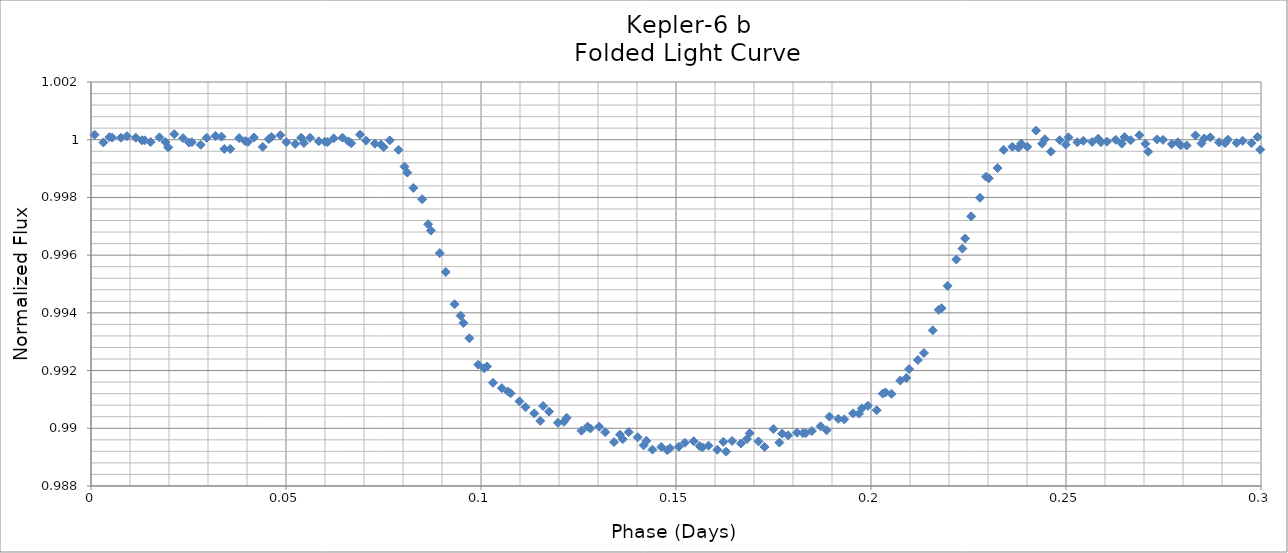
| Category | Series 0 |
|---|---|
| 2.442474000415206 | 1 |
| 2.462909000253678 | 1 |
| 2.483343000317365 | 1 |
| 2.503778000155837 | 1 |
| 2.524212000219524 | 1 |
| 2.544646000283212 | 1 |
| 2.565081000121683 | 1 |
| 2.585515000185371 | 1 |
| 2.605950000023842 | 1 |
| 2.62638400008753 | 1 |
| 2.646819000391662 | 1 |
| 2.667252999989689 | 1 |
| 2.687688000293821 | 1 |
| 2.708122000357509 | 1 |
| 2.728555999955535 | 1 |
| 2.748991000259668 | 1 |
| 2.769425000323356 | 1 |
| 2.789860000161827 | 1 |
| 2.810294000225515 | 1 |
| 2.830729000063986 | 1 |
| 2.851163000127673 | 1 |
| 2.871597000191361 | 1 |
| 2.892032000029832 | 1 |
| 2.91246600009352 | 1 |
| 2.932901000397653 | 1 |
| 2.95333499999568 | 1 |
| 2.973770000299812 | 1 |
| 2.994204000363499 | 1 |
| 3.014639000201971 | 1 |
| 3.035073000265658 | 1 |
| 3.055507000329346 | 1 |
| 3.075942000167817 | 1 |
| 3.096376000231505 | 1 |
| 3.116811000069976 | 1 |
| 3.137245000133664 | 1 |
| 3.157679999972135 | 1 |
| 3.178114000035823 | 1 |
| 3.19854800009951 | 1 |
| 3.218983000403643 | 1 |
| 0.00471700000166919 | 1 |
| 0.0251520003058019 | 1 |
| 0.0455860003694894 | 1 |
| 0.0660210002079609 | 1 |
| 0.0864550002716484 | 0.997 |
| 0.106889000335336 | 0.991 |
| 0.127324000173807 | 0.99 |
| 0.147758000237495 | 0.989 |
| 0.168193000075966 | 0.99 |
| 0.188627000139654 | 0.99 |
| 0.209061000203341 | 0.992 |
| 0.229496000041813 | 0.999 |
| 0.2499300001055 | 1 |
| 0.270365000409633 | 1 |
| 0.290800000248105 | 1 |
| 0.311234000311792 | 1 |
| 0.33166800037548 | 1 |
| 0.352103000213951 | 1 |
| 0.372537000277639 | 1 |
| 0.39297200011611 | 1 |
| 0.413406000179798 | 1 |
| 0.433841000018269 | 1 |
| 0.454275000081957 | 1 |
| 0.474709000145644 | 1 |
| 0.495143999984116 | 1 |
| 0.515578000047803 | 1 |
| 0.536013000351936 | 1 |
| 0.556447000415623 | 1 |
| 0.576882000254095 | 1 |
| 0.597316000317782 | 1 |
| 0.61775000038147 | 1 |
| 0.638185000219941 | 1 |
| 0.658619000283629 | 1 |
| 0.6790540001221 | 1 |
| 0.699488999960572 | 1 |
| 0.719922000249475 | 1 |
| 0.740357000087947 | 1 |
| 0.760791000151634 | 1 |
| 0.781225999990106 | 1 |
| 0.801661000294239 | 1 |
| 0.822095000357926 | 1 |
| 0.842528999955952 | 1 |
| 0.86296300001964 | 1 |
| 0.883398000323773 | 1 |
| 0.903833000162244 | 1 |
| 0.924267000225932 | 1 |
| 0.944702000064403 | 1 |
| 0.965135000353307 | 1 |
| 0.985570000191778 | 1 |
| 1.006004000255466 | 1 |
| 1.026439000093937 | 1 |
| 1.04687400039807 | 1 |
| 1.067307999996096 | 1 |
| 1.087742000059784 | 1 |
| 1.108176000123471 | 1 |
| 1.128610999961943 | 1 |
| 1.149046000266075 | 1 |
| 1.169480000329763 | 1 |
| 1.189915000168234 | 1 |
| 1.210349000231922 | 1 |
| 1.230783000295609 | 1 |
| 1.251218000134081 | 1 |
| 1.271652000197768 | 1 |
| 1.29208700003624 | 1 |
| 1.312522000340373 | 1 |
| 1.33295600040406 | 1 |
| 1.353390000002086 | 1 |
| 1.373824000065774 | 1 |
| 1.394259000369907 | 1 |
| 1.414694000208378 | 1 |
| 1.435128000272066 | 1 |
| 1.455563000110537 | 1 |
| 1.475996000399441 | 1 |
| 1.496431000237912 | 1 |
| 1.5168650003016 | 1 |
| 1.537300000140071 | 1 |
| 1.557734999978543 | 1 |
| 1.57816900004223 | 1 |
| 1.598603000105918 | 1 |
| 1.619037000169605 | 1 |
| 1.639472000008077 | 1 |
| 1.659907000312209 | 1 |
| 1.680341000375897 | 1 |
| 1.700776000214368 | 1 |
| 1.721210000278056 | 1 |
| 1.741644000341743 | 1 |
| 1.762079000180215 | 1 |
| 1.782513000243902 | 1 |
| 1.802948000082374 | 1 |
| 1.823382000146061 | 1 |
| 1.843816000209749 | 1 |
| 1.86425100004822 | 1 |
| 1.884685000111908 | 1 |
| 1.905120000416041 | 1 |
| 1.925555000254512 | 1 |
| 1.9459890003182 | 1 |
| 1.966424000156671 | 1 |
| 1.986856999979913 | 1 |
| 2.007292000284046 | 1 |
| 2.027726000347733 | 1 |
| 2.048161000186205 | 1 |
| 2.068596000024676 | 1 |
| 2.089030000088364 | 1 |
| 2.109464000152052 | 1 |
| 2.129898000215739 | 1 |
| 2.150333000054211 | 1 |
| 2.170768000358343 | 1 |
| 2.19120199995637 | 1 |
| 2.211637000260502 | 1 |
| 2.232070000083745 | 1 |
| 2.252505000387877 | 1 |
| 2.272940000226349 | 1 |
| 2.293374000290036 | 1 |
| 2.313809000128508 | 1 |
| 2.334243000192195 | 1 |
| 2.354677000255883 | 1 |
| 2.375112000094354 | 1 |
| 2.395546000158042 | 1 |
| 2.415980999996513 | 1 |
| 2.436415000060201 | 1 |
| 2.456850000364334 | 1 |
| 2.47728399996236 | 1 |
| 2.497718000026047 | 1 |
| 2.51815300033018 | 1 |
| 2.538587000393868 | 1 |
| 2.55902200023234 | 1 |
| 2.579457000070811 | 1 |
| 2.599890000359714 | 1 |
| 2.620325000198186 | 1 |
| 2.640759000261873 | 1 |
| 2.661194000100344 | 1 |
| 2.681628000164032 | 1 |
| 2.702063000002504 | 1 |
| 2.722498000306636 | 1 |
| 2.742931000129879 | 1 |
| 2.76336599996835 | 1 |
| 2.783801000272482 | 1 |
| 2.80423500033617 | 1 |
| 2.824670000174642 | 1 |
| 2.845104000238329 | 1 |
| 2.865538000302017 | 1 |
| 2.885972000365704 | 1 |
| 2.906407000204176 | 1 |
| 2.926842000042647 | 1 |
| 2.947276000106335 | 1 |
| 2.967711000410467 | 1 |
| 2.988145000008494 | 1 |
| 3.008579000072181 | 1 |
| 3.029014000376314 | 1 |
| 3.04944799997434 | 1 |
| 3.069883000278473 | 1 |
| 3.090318000116945 | 1 |
| 3.110751000405848 | 1 |
| 3.13118600024432 | 1 |
| 3.151620000308007 | 1 |
| 3.172055000146479 | 1 |
| 3.192489000210166 | 1 |
| 3.212924000048638 | 1 |
| 3.233358000112325 | 1 |
| 0.0190920001760126 | 1 |
| 0.0395270000144841 | 1 |
| 0.0599620003186167 | 1 |
| 0.0803960003823043 | 0.999 |
| 0.100829999980331 | 0.992 |
| 0.121264000044018 | 0.99 |
| 0.141699000348151 | 0.989 |
| 0.162134000186622 | 0.99 |
| 0.18256800025031 | 0.99 |
| 0.203003000088781 | 0.991 |
| 0.223437000152469 | 0.996 |
| 0.24387199999094 | 1 |
| 0.264306000054628 | 1 |
| 0.284740000118315 | 1 |
| 0.305174999956787 | 1 |
| 0.325609000020474 | 1 |
| 0.346044000324607 | 1 |
| 0.366478000388295 | 1 |
| 0.386911999986321 | 1 |
| 0.407347000290454 | 1 |
| 0.427781000354141 | 1 |
| 0.448216000192613 | 1 |
| 0.4686500002563 | 1 |
| 0.489085000094771 | 1 |
| 0.509519000158459 | 1 |
| 0.529953000222147 | 1 |
| 0.550388000060618 | 1 |
| 0.570822000124306 | 1 |
| 0.591256999962777 | 1 |
| 0.611691000026465 | 1 |
| 0.632125000090152 | 1 |
| 0.652560000394285 | 1 |
| 0.672995000232756 | 1 |
| 0.693429000296444 | 1 |
| 0.713863000360131 | 1 |
| 0.734298000198603 | 1 |
| 0.75473200026229 | 1 |
| 0.775167000100762 | 1 |
| 0.795601000164449 | 1 |
| 0.816035000228137 | 1 |
| 0.836470000066608 | 1 |
| 0.856905000370741 | 1 |
| 0.877338000193983 | 1 |
| 0.897773000032455 | 1 |
| 0.918208000336588 | 1 |
| 0.938642000400275 | 1 |
| 0.959077000238747 | 1 |
| 0.979511000302434 | 1 |
| 0.999945000366122 | 1 |
| 1.020380000204593 | 1 |
| 1.040814000268281 | 1 |
| 1.061248000331968 | 1 |
| 1.08168300017044 | 1 |
| 1.102118000008911 | 1 |
| 1.122553000313044 | 1 |
| 1.142986000136286 | 1 |
| 1.163420999974758 | 1 |
| 1.183855000038445 | 1 |
| 1.204290000342578 | 1 |
| 1.224724000406265 | 1 |
| 1.245159000244737 | 1 |
| 1.265593000308424 | 1 |
| 1.286027000372112 | 1 |
| 1.306462000210583 | 1 |
| 1.326896000274271 | 1 |
| 1.347331000112742 | 1 |
| 1.367766000416875 | 1 |
| 1.388199000240117 | 1 |
| 1.408634000078589 | 1 |
| 1.429068000142276 | 1 |
| 1.449502999980748 | 1 |
| 1.46993800028488 | 1 |
| 1.490372000348568 | 1 |
| 1.510806000412256 | 1 |
| 1.531241000250727 | 1 |
| 1.551675000314415 | 1 |
| 1.572110000152886 | 1 |
| 1.592544000216574 | 1 |
| 1.612979000055045 | 1 |
| 1.633413000118732 | 1 |
| 1.65384700018242 | 1 |
| 1.674282000020891 | 1 |
| 1.69471600008458 | 1 |
| 1.715151000388712 | 1 |
| 1.735584999986738 | 1 |
| 1.756019000050426 | 1 |
| 1.776454000354558 | 1 |
| 1.796888000418246 | 1 |
| 1.817323000256717 | 1 |
| 1.837757000320405 | 1 |
| 1.858192000158876 | 1 |
| 1.878626999997348 | 1 |
| 1.899060000286251 | 1 |
| 1.919495000124723 | 1 |
| 1.93992900018841 | 1 |
| 1.960364000026882 | 1 |
| 1.980798000090569 | 1 |
| 2.001233000394702 | 1 |
| 2.021666999992728 | 1 |
| 2.042102000296861 | 1 |
| 2.062536000360549 | 1 |
| 2.082969999958575 | 1 |
| 2.103405000262708 | 1 |
| 2.12384000010118 | 1 |
| 2.144274000164867 | 1 |
| 2.164708000228554 | 1 |
| 2.185142000292242 | 1 |
| 2.205577000130713 | 1 |
| 2.226011999969185 | 1 |
| 2.246446000032872 | 1 |
| 2.26688000009656 | 1 |
| 2.287315000400692 | 1 |
| 2.307748999998719 | 1 |
| 2.328184000302851 | 1 |
| 2.348618000366539 | 1 |
| 2.36905300020501 | 1 |
| 2.389487000268698 | 1 |
| 2.409921000332385 | 1 |
| 2.450790000234544 | 1 |
| 2.471225000073016 | 1 |
| 2.491660000377148 | 1 |
| 2.512093000200391 | 1 |
| 2.532528000038862 | 1 |
| 2.55296200010255 | 1 |
| 2.573397000406682 | 1 |
| 2.593832000245154 | 1 |
| 2.614266000308842 | 1 |
| 2.634701000147312 | 1 |
| 2.655135000211 | 1 |
| 2.675569000274688 | 1 |
| 2.696003000338376 | 1 |
| 2.716438000176847 | 1 |
| 2.736873000015318 | 1 |
| 2.757307000079006 | 1 |
| 2.777741000142693 | 1 |
| 2.798175000206381 | 1 |
| 2.818610000044853 | 1 |
| 2.839045000348985 | 1 |
| 2.859479000412673 | 1 |
| 2.879914000251144 | 1 |
| 2.900348000314832 | 1 |
| 2.920782000378519 | 1 |
| 2.941217000216991 | 1 |
| 2.961651000280678 | 1 |
| 2.98208600011915 | 1 |
| 3.002520999957621 | 1 |
| 3.022954000246525 | 1 |
| 3.043388000310212 | 1 |
| 3.063823000148684 | 1 |
| 3.084257999987155 | 1 |
| 3.104693000291288 | 1 |
| 3.125127000354975 | 1 |
| 3.145561000418663 | 1 |
| 3.165995000016689 | 1 |
| 3.186430000320822 | 1 |
| 3.20686400038451 | 1 |
| 3.227299000222981 | 1 |
| 0.0130340000614524 | 1 |
| 0.0334670003503561 | 1 |
| 0.0539020001888275 | 1 |
| 0.0743360002525151 | 1 |
| 0.0947710000909865 | 0.994 |
| 0.115206000395119 | 0.99 |
| 0.135639999993145 | 0.99 |
| 0.156075000297278 | 0.989 |
| 0.176508000120521 | 0.99 |
| 0.196942999958992 | 0.991 |
| 0.217378000263125 | 0.994 |
| 0.237812000326812 | 1 |
| 0.258247000165284 | 1 |
| 0.278682000003755 | 1 |
| 0.299115000292659 | 1 |
| 0.319549000356346 | 1 |
| 0.339984000194818 | 1 |
| 0.360419000033289 | 1 |
| 0.380853000096977 | 1 |
| 0.401288000401109 | 1 |
| 0.421721999999136 | 1 |
| 0.442156000062823 | 1 |
| 0.462591000366956 | 1 |
| 0.483024999964982 | 1 |
| 0.503460000269115 | 1 |
| 0.523895000107586 | 1 |
| 0.54432800039649 | 1 |
| 0.564763000234961 | 1 |
| 0.585197000298649 | 1 |
| 0.60563200013712 | 1 |
| 0.626066999975592 | 1 |
| 0.646501000039279 | 1 |
| 0.666935000102967 | 1 |
| 0.687369000166654 | 1 |
| 0.707804000005126 | 1 |
| 0.728239000309259 | 1 |
| 0.748673000372946 | 1 |
| 0.769108000211418 | 1 |
| 0.789542000275105 | 1 |
| 0.809976000338793 | 1 |
| 0.83041000040248 | 1 |
| 0.850845000240952 | 1 |
| 0.871280000079423 | 1 |
| 0.891715000383556 | 1 |
| 0.912148999981582 | 1 |
| 0.932582000270486 | 1 |
| 0.953017000108957 | 1 |
| 0.973451000172645 | 1 |
| 0.993887000251561 | 1 |
| 1.014321000315249 | 1 |
| 1.03475600015372 | 1 |
| 1.055188999976963 | 1 |
| 1.07562300004065 | 1 |
| 1.096059000119567 | 1 |
| 1.116493000183254 | 1 |
| 1.136928000021726 | 1 |
| 1.157362000085413 | 1 |
| 1.177795000374317 | 1 |
| 1.198230000212789 | 1 |
| 1.21866500005126 | 1 |
| 1.239100000355393 | 1 |
| 1.25953400041908 | 1 |
| 1.279969000257552 | 1 |
| 1.300402000080794 | 1 |
| 1.320837000384927 | 1 |
| 1.341272000223398 | 1 |
| 1.361706000287086 | 1 |
| 1.382141000125557 | 1 |
| 1.402575000189245 | 1 |
| 1.423008000012487 | 1 |
| 1.443444000091404 | 1 |
| 1.463878000155091 | 1 |
| 1.484312999993563 | 1 |
| 1.50474700005725 | 1 |
| 1.525182000361383 | 1 |
| 1.545615000184625 | 1 |
| 1.566050000023097 | 1 |
| 1.586485000327229 | 1 |
| 1.606919000390917 | 1 |
| 1.627354000229388 | 1 |
| 1.647788000293076 | 1 |
| 1.668223000131547 | 1 |
| 1.688657000195235 | 1 |
| 1.709091000258923 | 1 |
| 1.729526000097394 | 1 |
| 1.749960000161081 | 1 |
| 1.770394999999553 | 1 |
| 1.790830000303686 | 1 |
| 1.811263000126928 | 1 |
| 1.831697999965399 | 1 |
| 1.852132000029087 | 1 |
| 1.87256700033322 | 1 |
| 1.893002000171691 | 1 |
| 1.913436000235379 | 1 |
| 1.933870000299066 | 1 |
| 1.954304000362754 | 1 |
| 1.974739000201225 | 1 |
| 1.995174000039697 | 1 |
| 2.015609000343829 | 1 |
| 2.036043000407517 | 1 |
| 2.056476000230759 | 1 |
| 2.076911000069231 | 1 |
| 2.097345000132918 | 1 |
| 2.117781000211835 | 1 |
| 2.138215000275522 | 1 |
| 2.15864900033921 | 1 |
| 2.179083000402898 | 1 |
| 2.199517000000924 | 1 |
| 2.219952000305057 | 1 |
| 2.240387000143528 | 1 |
| 2.260821999982 | 1 |
| 2.281256000045687 | 1 |
| 2.301689000334591 | 1 |
| 2.322124000173062 | 1 |
| 2.34255800023675 | 1 |
| 2.362994000315666 | 1 |
| 2.383428000379354 | 1 |
| 2.403863000217825 | 1 |
| 2.424297000281512 | 1 |
| 2.444730000104755 | 1 |
| 0.476966000075638 | 1 |
| 0.497400000139326 | 1 |
| 0.517834999977797 | 1 |
| 0.538269000041485 | 1 |
| 0.558704000345617 | 1 |
| 0.579138000409305 | 1 |
| 0.599572000007331 | 1 |
| 0.620007000311464 | 1 |
| 0.640441000375151 | 1 |
| 0.660876000213623 | 1 |
| 0.68131000027731 | 1 |
| 0.701745000115782 | 1 |
| 0.722179000179469 | 1 |
| 0.742613000243157 | 1 |
| 0.763048000081628 | 1 |
| 0.783482000145316 | 1 |
| 0.803916999983787 | 1 |
| 0.824351000047475 | 1 |
| 0.844786000351608 | 1 |
| 0.865220000415295 | 1 |
| 0.885655000253767 | 1 |
| 0.906089000317454 | 1 |
| 0.926523000381142 | 1 |
| 0.946958000219613 | 1 |
| 0.967392000283301 | 1 |
| 0.987827000121772 | 1 |
| 1.00826100018546 | 1 |
| 1.028696000023931 | 1 |
| 1.049130000087619 | 1 |
| 1.069564000151306 | 1 |
| 1.089998999989778 | 1 |
| 1.110433000053465 | 1 |
| 1.130868000357598 | 1 |
| 1.151301999955624 | 1 |
| 1.171737000259757 | 1 |
| 1.192171000323444 | 1 |
| 1.212605000387132 | 1 |
| 1.233040000225603 | 1 |
| 1.253474000289291 | 1 |
| 1.273909000127762 | 1 |
| 1.29434300019145 | 1 |
| 1.314778000029921 | 1 |
| 1.335212000093609 | 1 |
| 1.355646000157296 | 1 |
| 1.376080999995768 | 1 |
| 1.396515000059455 | 1 |
| 1.416950000363588 | 1 |
| 1.437383999961614 | 1 |
| 1.457819000265747 | 1 |
| 1.478253000329435 | 1 |
| 1.498687000393122 | 1 |
| 1.519122000231594 | 1 |
| 1.539556000295281 | 1 |
| 1.559991000133753 | 1 |
| 1.58042500019744 | 1 |
| 1.600860000035912 | 1 |
| 1.621294000099599 | 1 |
| 1.641729000403732 | 1 |
| 1.662163000001758 | 1 |
| 1.682597000065446 | 1 |
| 1.703032000369578 | 1 |
| 1.723465999967605 | 1 |
| 1.743901000271737 | 1 |
| 1.764335000335425 | 1 |
| 1.784770000173896 | 1 |
| 1.805204000237584 | 1 |
| 1.825638000301271 | 1 |
| 1.846073000139743 | 1 |
| 1.86650700020343 | 1 |
| 1.886942000041902 | 1 |
| 1.907376000105589 | 1 |
| 1.927811000409722 | 1 |
| 1.948245000007748 | 1 |
| 1.968680000311881 | 1 |
| 1.989114000375569 | 1 |
| 2.009547999973595 | 1 |
| 2.029983000277728 | 1 |
| 2.050417000341415 | 1 |
| 2.070852000179887 | 1 |
| 2.091286000243574 | 1 |
| 2.111721000082046 | 1 |
| 2.132155000145733 | 1 |
| 2.152589000209421 | 1 |
| 2.173024000047892 | 1 |
| 2.19345800011158 | 1 |
| 2.213893000415712 | 1 |
| 2.234327000013739 | 1 |
| 2.254762000317871 | 1 |
| 2.275196000381559 | 1 |
| 2.295629999979585 | 1 |
| 2.316065000283718 | 1 |
| 2.336499000347405 | 1 |
| 2.356934000185877 | 1 |
| 2.377368000249564 | 1 |
| 2.397803000088036 | 1 |
| 2.418237000151723 | 1 |
| 2.438671000215411 | 1 |
| 2.459106000053882 | 1 |
| 2.47954000011757 | 1 |
| 2.499974999956041 | 1 |
| 2.520409000019729 | 1 |
| 2.540844000323862 | 1 |
| 2.561278000387549 | 1 |
| 2.581713000226021 | 1 |
| 2.602147000289708 | 1 |
| 2.62258200012818 | 1 |
| 2.643016000191867 | 1 |
| 2.663450000255555 | 1 |
| 2.683885000094026 | 1 |
| 2.704319000157713 | 1 |
| 2.724753999996185 | 1 |
| 2.745188000059873 | 1 |
| 2.76562200012356 | 1 |
| 2.786056999962032 | 1 |
| 2.806491000025719 | 1 |
| 2.826926000329852 | 1 |
| 2.847360000393539 | 1 |
| 2.867795000232011 | 1 |
| 2.888229000295698 | 1 |
| 2.90866400013417 | 1 |
| 2.929098000197857 | 1 |
| 2.949532000261545 | 1 |
| 2.969967000100016 | 1 |
| 2.990401000163704 | 1 |
| 3.010836000002175 | 1 |
| 3.031270000065863 | 1 |
| 3.051705000369996 | 1 |
| 3.072138999968022 | 1 |
| 3.09257300003171 | 1 |
| 3.113008000335842 | 1 |
| 3.13344200039953 | 1 |
| 3.153877000238001 | 1 |
| 3.174311000301689 | 1 |
| 3.19474600014016 | 1 |
| 3.215180000203848 | 1 |
| 0.000914000267535186 | 1 |
| 0.0213490001060066 | 1 |
| 0.0417830001696942 | 1 |
| 0.0622180000081656 | 1 |
| 0.0826520000718531 | 0.998 |
| 0.103087000375986 | 0.992 |
| 0.143956000278145 | 0.989 |
| 0.164390000341832 | 0.99 |
| 0.18482400040552 | 0.99 |
| 0.205259000243991 | 0.991 |
| 0.225693000307679 | 0.997 |
| 0.24612800014615 | 1 |
| 0.266562000209838 | 1 |
| 0.286996000273525 | 1 |
| 0.307431000111997 | 1 |
| 0.327865000175684 | 1 |
| 0.348300000014156 | 1 |
| 0.368734000077843 | 1 |
| 0.389169000381976 | 1 |
| 0.409602999980002 | 1 |
| 0.430038000284135 | 1 |
| 0.450472000347823 | 1 |
| 0.470907000186294 | 1 |
| 0.491341000249982 | 1 |
| 0.511775000313669 | 1 |
| 0.532210000152141 | 1 |
| 0.552644000215828 | 1 |
| 0.5730790000543 | 1 |
| 0.593513000117987 | 1 |
| 0.613947999956458 | 1 |
| 0.634382000020146 | 1 |
| 0.654816000083834 | 1 |
| 0.675251000387966 | 1 |
| 0.695684999985993 | 1 |
| 0.716120000290125 | 1 |
| 0.736554000353813 | 1 |
| 0.756989000192284 | 1 |
| 0.777423000255972 | 1 |
| 0.797857000319659 | 1 |
| 0.818292000158131 | 1 |
| 0.838726000221818 | 1 |
| 0.85916100006029 | 1 |
| 0.879595000123977 | 1 |
| 0.900029999962449 | 1 |
| 0.920464000026136 | 1 |
| 0.940898000089824 | 1 |
| 0.961333000393957 | 1 |
| 0.981766999991983 | 1 |
| 1.002202000296116 | 1 |
| 1.022636000359803 | 1 |
| 1.043071000198275 | 1 |
| 1.063505000261962 | 1 |
| 1.08393900032565 | 1 |
| 1.104374000164121 | 1 |
| 1.124808000227809 | 1 |
| 1.14524300006628 | 1 |
| 1.165677000129968 | 1 |
| 1.18611199996844 | 1 |
| 1.206546000032127 | 1 |
| 1.226981000336259 | 1 |
| 1.247415000399947 | 1 |
| 1.267848999997973 | 1 |
| 1.288284000302106 | 1 |
| 1.308718000365793 | 1 |
| 1.329153000204265 | 1 |
| 1.349587000267952 | 1 |
| 1.370022000106424 | 1 |
| 1.390456000170111 | 1 |
| 1.410891000008583 | 1 |
| 1.43132500007227 | 1 |
| 1.451759000135958 | 1 |
| 1.472193999974429 | 1 |
| 1.492628000038117 | 1 |
| 1.51306300034225 | 1 |
| 1.533497000405937 | 1 |
| 1.553932000244409 | 1 |
| 1.574366000308096 | 1 |
| 1.594800000371784 | 1 |
| 1.615235000210255 | 1 |
| 1.635669000273943 | 1 |
| 1.656104000112414 | 1 |
| 1.676538000176102 | 1 |
| 1.696973000014573 | 1 |
| 1.717407000078261 | 1 |
| 1.737841000141948 | 1 |
| 1.75827599998042 | 1 |
| 1.778710000044107 | 1 |
| 1.79914500034824 | 1 |
| 1.819579000411927 | 1 |
| 1.840014000250399 | 1 |
| 1.860448000314086 | 1 |
| 1.880882000377774 | 1 |
| 1.901317000216245 | 1 |
| 1.921751000279933 | 1 |
| 1.942186000118404 | 1 |
| 1.962620000182092 | 1 |
| 1.983055000020563 | 1 |
| 2.003489000084251 | 1 |
| 2.023923000147938 | 1 |
| 2.04435799998641 | 1 |
| 2.064792000050097 | 1 |
| 2.08522700035423 | 1 |
| 2.105661000417917 | 1 |
| 2.12609600025639 | 1 |
| 2.146530000320076 | 1 |
| 2.166965000158548 | 1 |
| 2.187399000222235 | 1 |
| 2.207833000285923 | 1 |
| 2.228268000124395 | 1 |
| 2.248702000188082 | 1 |
| 2.269137000026553 | 1 |
| 2.289571000090241 | 1 |
| 2.310006000394374 | 1 |
| 2.3304399999924 | 1 |
| 2.350874000056088 | 1 |
| 2.37130900036022 | 1 |
| 2.391742999958247 | 1 |
| 2.412178000262379 | 1 |
| 2.432612000326067 | 1 |
| 2.453047000164538 | 1 |
| 2.473481000228226 | 1 |
| 2.493916000066697 | 1 |
| 2.514350000130385 | 1 |
| 2.534784000194072 | 1 |
| 2.555219000032544 | 1 |
| 2.575653000096231 | 1 |
| 2.596088000400364 | 1 |
| 2.61652199999839 | 1 |
| 2.636957000302523 | 1 |
| 2.65739100036621 | 1 |
| 2.677824999964237 | 1 |
| 2.69826000026837 | 1 |
| 2.718694000332057 | 1 |
| 2.739129000170529 | 1 |
| 2.759563000234216 | 1 |
| 2.779998000072688 | 1 |
| 2.800432000136375 | 1 |
| 2.820866000200063 | 1 |
| 2.841301000038534 | 1 |
| 2.861735000102222 | 1 |
| 2.882170000406354 | 1 |
| 2.902604000004381 | 1 |
| 2.923039000308513 | 1 |
| 2.943473000372201 | 1 |
| 2.963908000210672 | 1 |
| 2.98434200027436 | 1 |
| 3.004776000338047 | 1 |
| 3.025211000176519 | 1 |
| 3.045645000240206 | 1 |
| 3.066080000078678 | 1 |
| 3.086514000142365 | 1 |
| 3.127383000044524 | 1 |
| 3.147817000108212 | 1 |
| 3.168252000412345 | 1 |
| 3.188686000010371 | 1 |
| 3.209121000314503 | 1 |
| 3.229555000378191 | 1 |
| 0.0152900002166625 | 1 |
| 0.03572400028035 | 1 |
| 0.0561590001188215 | 1 |
| 0.076593000182509 | 1 |
| 0.0970270002461966 | 0.993 |
| 0.117462000084668 | 0.991 |
| 0.137896000148356 | 0.99 |
| 0.158330999986827 | 0.989 |
| 0.178765000050515 | 0.99 |
| 0.199200000354647 | 0.991 |
| 0.219634000418335 | 0.995 |
| 0.240068000016361 | 1 |
| 0.260503000320494 | 1 |
| 0.280937000384181 | 1 |
| 0.301372000222653 | 1 |
| 0.32180600028634 | 1 |
| 0.342241000124812 | 1 |
| 0.362675000188499 | 1 |
| 0.383109000252187 | 1 |
| 0.403544000090658 | 1 |
| 0.423978000154346 | 1 |
| 0.444412999992817 | 1 |
| 0.464847000056505 | 1 |
| 0.485282000360637 | 1 |
| 0.505715999958664 | 1 |
| 0.526150000022351 | 1 |
| 0.546585000326484 | 1 |
| 0.567019000390172 | 1 |
| 0.587454000228643 | 1 |
| 0.60788800029233 | 1 |
| 0.628323000130802 | 1 |
| 0.648757000194489 | 1 |
| 0.669191000258177 | 1 |
| 0.689626000096648 | 1 |
| 0.710060000160336 | 1 |
| 0.730494999998807 | 1 |
| 0.750929000062495 | 1 |
| 0.771364000366628 | 1 |
| 0.791797999964654 | 1 |
| 0.812233000268787 | 1 |
| 0.832667000332474 | 1 |
| 0.853102000170946 | 1 |
| 0.873536000234633 | 1 |
| 0.893970000298321 | 1 |
| 0.914405000136792 | 1 |
| 0.93483900020048 | 1 |
| 0.955274000038951 | 1 |
| 0.975708000102639 | 1 |
| 0.996143000406771 | 1 |
| 1.016577000004798 | 1 |
| 1.037011000068485 | 1 |
| 1.057446000372618 | 1 |
| 1.077879999970644 | 1 |
| 1.098315000274777 | 1 |
| 1.118749000338465 | 1 |
| 1.139184000176936 | 1 |
| 1.159618000240624 | 1 |
| 1.180052000304311 | 1 |
| 1.200487000142783 | 1 |
| 1.22092100020647 | 1 |
| 1.241356000044941 | 1 |
| 1.261790000108629 | 1 |
| 1.282225000412762 | 1 |
| 1.302659000010788 | 1 |
| 1.323093000074476 | 1 |
| 1.343528000378608 | 1 |
| 1.363961999976635 | 1 |
| 1.384397000280767 | 1 |
| 1.404831000344455 | 1 |
| 1.425266000182926 | 1 |
| 1.445700000246614 | 1 |
| 1.466134000310301 | 1 |
| 1.486569000148773 | 1 |
| 1.50700300021246 | 1 |
| 1.527438000050932 | 1 |
| 1.547872000114619 | 1 |
| 1.568307000418752 | 1 |
| 1.588741000016778 | 1 |
| 1.609176000320911 | 1 |
| 1.629610000384598 | 1 |
| 1.650043999982625 | 1 |
| 1.670479000286757 | 1 |
| 1.690913000350445 | 1 |
| 1.711348000188916 | 1 |
| 1.731782000252604 | 1 |
| 1.752217000091075 | 1 |
| 1.772651000154763 | 1 |
| 1.793085000218451 | 1 |
| 1.813520000056922 | 1 |
| 1.83395400012061 | 1 |
| 1.854388999959081 | 1 |
| 1.874823000022769 | 1 |
| 1.895258000326901 | 1 |
| 1.915692000390589 | 1 |
| 1.93612700022906 | 1 |
| 1.956561000292748 | 1 |
| 1.976995000356435 | 1 |
| 1.997430000194907 | 1 |
| 2.017864000258594 | 1 |
| 2.038299000097066 | 1 |
| 2.058733000160753 | 1 |
| 2.079167999999225 | 1 |
| 2.099602000062912 | 1 |
| 2.1200360001266 | 1 |
| 2.140470999965071 | 1 |
| 2.160905000028759 | 1 |
| 2.181340000332892 | 1 |
| 2.20177400039658 | 1 |
| 2.222209000235051 | 1 |
| 2.242643000298738 | 1 |
| 2.263077000362425 | 1 |
| 2.283512000200897 | 1 |
| 2.303946000264585 | 1 |
| 2.324381000103056 | 1 |
| 2.344815000166744 | 1 |
| 2.365250000005215 | 1 |
| 2.385684000068903 | 1 |
| 2.40611800013259 | 1 |
| 2.426552999971062 | 1 |
| 2.446987000034749 | 1 |
| 2.467422000338882 | 1 |
| 2.487856000402569 | 1 |
| 2.508291000241041 | 1 |
| 2.528725000304728 | 1 |
| 2.5491600001432 | 1 |
| 2.569594000206887 | 1 |
| 2.590028000270575 | 1 |
| 2.610463000109046 | 1 |
| 2.630897000172734 | 1 |
| 2.651332000011205 | 1 |
| 2.671766000074893 | 1 |
| 2.692201000379025 | 1 |
| 2.712634999977052 | 1 |
| 2.733069000040739 | 1 |
| 2.753504000344872 | 1 |
| 2.77393800040856 | 1 |
| 2.794373000247031 | 1 |
| 2.814807000310719 | 1 |
| 2.83524200014919 | 1 |
| 2.876110000276565 | 1 |
| 2.896545000115037 | 1 |
| 2.916979000178724 | 1 |
| 2.937414000017196 | 1 |
| 2.957848000080883 | 1 |
| 2.978283000385016 | 1 |
| 2.998716999983042 | 1 |
| 3.01915100004673 | 1 |
| 3.039586000350862 | 1 |
| 3.06002000041455 | 1 |
| 3.080455000253021 | 1 |
| 3.100889000316709 | 1 |
| 3.12132400015518 | 1 |
| 3.141758000218868 | 1 |
| 3.162192000282555 | 1 |
| 3.182627000121027 | 1 |
| 3.203061000184714 | 1 |
| 3.223496000023186 | 1 |
| 0.00923000008687324 | 1 |
| 0.0296650003910059 | 1 |
| 0.0500989999890322 | 1 |
| 0.0705340002931649 | 1 |
| 0.0909680003568525 | 0.995 |
| 0.111403000195324 | 0.991 |
| 0.131837000259011 | 0.99 |
| 0.152271000322699 | 0.989 |
| 0.17270600016117 | 0.989 |
| 0.193140000224858 | 0.99 |
| 0.213575000063329 | 0.993 |
| 0.234009000127017 | 1 |
| 0.254443000190705 | 1 |
| 0.274878000029176 | 1 |
| 0.295312000092863 | 1 |
| 0.315747000396996 | 1 |
| 0.336180999995022 | 1 |
| 0.356616000299155 | 1 |
| 0.377050000362843 | 1 |
| 0.397485000201314 | 1 |
| 0.417919000265002 | 1 |
| 0.438353000328689 | 1 |
| 0.458788000167161 | 1 |
| 0.479222000230848 | 1 |
| 0.49965700006932 | 1 |
| 0.520091000133007 | 1 |
| 0.540525999971479 | 1 |
| 0.560960000035166 | 1 |
| 0.581394000098854 | 1 |
| 0.601829000402986 | 1 |
| 0.622263000001013 | 1 |
| 0.642698000305145 | 1 |
| 0.663132000368833 | 1 |
| 0.683567000207304 | 1 |
| 0.704001000270992 | 1 |
| 0.724435000334679 | 1 |
| 0.744870000173151 | 1 |
| 0.765304000236838 | 1 |
| 0.78573900007531 | 1 |
| 0.806173000138997 | 1 |
| 0.826607999977469 | 1 |
| 0.847042000041156 | 1 |
| 0.867477000345289 | 1 |
| 0.887911000408977 | 1 |
| 0.908345000007003 | 1 |
| 0.928780000311136 | 1 |
| 0.949214000374823 | 1 |
| 0.969649000213295 | 1 |
| 0.990083000276982 | 1 |
| 1.010518000115454 | 1 |
| 1.030952000179141 | 1 |
| 1.051386000242829 | 1 |
| 1.0718210000813 | 1 |
| 1.092255000144988 | 1 |
| 1.11268999998346 | 1 |
| 1.133124000047147 | 1 |
| 1.153559000351279 | 1 |
| 1.173993000414967 | 1 |
| 1.194428000253438 | 1 |
| 1.214862000317126 | 1 |
| 1.235296000380814 | 1 |
| 1.255731000219285 | 1 |
| 1.276165000282973 | 1 |
| 1.296600000121444 | 1 |
| 1.317034000185131 | 1 |
| 1.337469000023603 | 1 |
| 1.35790300008729 | 1 |
| 1.378337000150978 | 1 |
| 1.398771999989449 | 1 |
| 1.419206000053137 | 1 |
| 1.43964100035727 | 1 |
| 1.460074999955296 | 1 |
| 1.480510000259429 | 1 |
| 1.500944000323116 | 1 |
| 1.521378000386804 | 1 |
| 1.541813000225275 | 1 |
| 1.562247000288963 | 1 |
| 1.582682000127434 | 1 |
| 1.603116000191122 | 1 |
| 1.623551000029593 | 1 |
| 1.643985000093281 | 1 |
| 1.664419000156968 | 1 |
| 1.68485399999544 | 1 |
| 1.705288000059127 | 1 |
| 1.72572300036326 | 1 |
| 1.746156999961286 | 1 |
| 1.766592000265419 | 1 |
| 1.787026000329106 | 1 |
| 1.807461000167578 | 1 |
| 1.827895000231265 | 1 |
| 1.848329000294953 | 1 |
| 1.868764000133424 | 1 |
| 1.889198000197112 | 1 |
| 1.909633000035583 | 1 |
| 1.930067000099271 | 1 |
| 1.950502000403404 | 1 |
| 1.97093600000143 | 1 |
| 1.991370000065118 | 1 |
| 2.01180500036925 | 1 |
| 2.032238999967277 | 1 |
| 2.052674000271409 | 1 |
| 2.073108000335097 | 1 |
| 2.093543000173568 | 1 |
| 2.113977000237256 | 1 |
| 2.134412000075727 | 1 |
| 2.154846000139415 | 1 |
| 2.175280000203102 | 1 |
| 2.195715000041574 | 1 |
| 2.216149000105261 | 1 |
| 2.236584000409394 | 1 |
| 2.25701800000742 | 1 |
| 2.277453000311553 | 1 |
| 2.29788700037524 | 1 |
| 2.318320999973267 | 1 |
| 2.338756000277399 | 1 |
| 2.359190000341087 | 1 |
| 2.379625000179558 | 1 |
| 2.400059000243246 | 1 |
| 2.420494000081717 | 1 |
| 2.440928000145405 | 1 |
| 2.461362000209093 | 1 |
| 2.481797000047564 | 1 |
| 2.502231000111252 | 1 |
| 2.522666000415384 | 1 |
| 2.54310000001341 | 1 |
| 2.563535000317543 | 1 |
| 2.583969000381231 | 1 |
| 2.62483800028339 | 1 |
| 2.645272000347077 | 1 |
| 2.665707000185549 | 1 |
| 2.686141000249236 | 1 |
| 2.706576000087708 | 1 |
| 2.727010000151395 | 1 |
| 2.747444000215083 | 1 |
| 2.767879000053554 | 1 |
| 2.788313000117242 | 1 |
| 2.808747999955713 | 1 |
| 2.829182000019401 | 1 |
| 2.849617000323533 | 1 |
| 2.870051000387221 | 1 |
| 2.890486000225692 | 1 |
| 2.91092000028938 | 1 |
| 2.931355000127851 | 1 |
| 2.951789000191539 | 1 |
| 2.972223000255227 | 1 |
| 2.992658000093698 | 1 |
| 3.013092000157386 | 1 |
| 3.033526999995857 | 1 |
| 3.053961000059545 | 1 |
| 3.074395000123232 | 1 |
| 3.094829999961703 | 1 |
| 3.115264000025391 | 1 |
| 3.135699000329524 | 1 |
| 3.156133000393211 | 1 |
| 3.176568000231683 | 1 |
| 3.19700200029537 | 1 |
| 3.217437000133842 | 1 |
| 0.00317100019752914 | 1 |
| 0.0236050002612167 | 1 |
| 0.0440400000996881 | 1 |
| 0.0644740001633757 | 1 |
| 0.0849090000018471 | 0.998 |
| 0.105343000065535 | 0.991 |
| 0.125778000369667 | 0.99 |
| 0.146211999967694 | 0.989 |
| 0.166646000031381 | 0.989 |
| 0.187081000335514 | 0.99 |
| 0.207515000399201 | 0.992 |
| 0.227950000237673 | 0.998 |
| 0.24838400030136 | 1 |
| 0.268819000139832 | 1 |
| 0.289253000203519 | 1 |
| 0.309687000267207 | 1 |
| 0.330122000105678 | 1 |
| 0.350556000169366 | 1 |
| 0.370991000007837 | 1 |
| 0.391425000071525 | 1 |
| 0.411860000375658 | 1 |
| 0.432293999973684 | 1 |
| 0.452729000277817 | 1 |
| 0.473163000341504 | 1 |
| 0.493597000405192 | 1 |
| 0.514032000243663 | 1 |
| 0.534466000307351 | 1 |
| 0.554901000145822 | 1 |
| 0.57533500020951 | 1 |
| 0.595770000047981 | 1 |
| 0.616204000111669 | 1 |
| 0.636638000175356 | 1 |
| 0.657073000013828 | 1 |
| 0.677507000077515 | 1 |
| 0.697942000381648 | 1 |
| 0.718375999979674 | 1 |
| 0.738811000283807 | 1 |
| 0.759245000347494 | 1 |
| 0.779680000185966 | 1 |
| 0.800114000249653 | 1 |
| 0.820548000313341 | 1 |
| 0.840983000151812 | 1 |
| 0.8614170002155 | 1 |
| 0.881852000053971 | 1 |
| 0.902286000117659 | 1 |
| 0.922720000181346 | 1 |
| 0.943155000019818 | 1 |
| 0.963589000083505 | 1 |
| 0.984024000387638 | 1 |
| 1.004457999985664 | 1 |
| 1.024893000289797 | 1 |
| 1.045327000353485 | 1 |
| 1.065762000191956 | 1 |
| 1.086196000255644 | 1 |
| 1.106630000319331 | 1 |
| 1.127065000157803 | 1 |
| 1.14749900022149 | 1 |
| 1.167934000059962 | 1 |
| 1.18836800012365 | 1 |
| 1.208802999962121 | 1 |
| 1.229237000025808 | 1 |
| 1.249672000329941 | 1 |
| 1.270106000393628 | 1 |
| 1.290539999991655 | 1 |
| 1.310975000295787 | 1 |
| 1.331409000359475 | 1 |
| 1.351844000197946 | 1 |
| 1.372278000261634 | 1 |
| 1.392713000100105 | 1 |
| 1.413147000163793 | 1 |
| 1.43358100022748 | 1 |
| 1.454016000065952 | 1 |
| 1.474450000129639 | 1 |
| 1.494884999968111 | 1 |
| 1.515319000031798 | 1 |
| 1.535754000335931 | 1 |
| 1.556188000399619 | 1 |
| 1.576621999997645 | 1 |
| 1.597057000301778 | 1 |
| 1.617491000365465 | 1 |
| 1.637926000203937 | 1 |
| 1.658360000267624 | 1 |
| 1.678795000106096 | 1 |
| 1.699229000169783 | 1 |
| 1.719663000233471 | 1 |
| 1.740098000071942 | 1 |
| 1.76053200013563 | 1 |
| 1.780966999974101 | 1 |
| 1.801401000037789 | 1 |
| 1.821836000341921 | 1 |
| 1.842270000405609 | 1 |
| 1.862704000003635 | 1 |
| 1.883139000307768 | 1 |
| 1.903573000371455 | 1 |
| 1.924008000209927 | 1 |
| 1.944442000273614 | 1 |
| 1.964877000112086 | 1 |
| 1.985311000175773 | 1 |
| 2.005745000239461 | 1 |
| 2.026180000077932 | 1 |
| 2.04661400014162 | 1 |
| 2.067048999980091 | 1 |
| 2.087483000043779 | 1 |
| 2.107918000347911 | 1 |
| 2.1283520004116 | 1 |
| 2.14878700025007 | 1 |
| 2.169221000313758 | 1 |
| 2.189655000377446 | 1 |
| 2.210090000215917 | 1 |
| 2.230524000279605 | 1 |
| 2.250959000118076 | 1 |
| 2.271393000181764 | 1 |
| 2.291828000020235 | 1 |
| 2.312262000083923 | 1 |
| 2.332697000388055 | 1 |
| 2.373565000049769 | 1 |
| 2.394000000353902 | 1 |
| 2.414434000417589 | 1 |
| 2.434869000256061 | 1 |
| 2.455303000319748 | 1 |
| 2.47573800015822 | 1 |
| 2.496172000221907 | 1 |
| 2.516606000285595 | 1 |
| 2.537041000124066 | 1 |
| 2.557475000187754 | 1 |
| 2.577910000026225 | 1 |
| 2.598344000089913 | 1 |
| 2.618779000394046 | 1 |
| 2.639212999992072 | 1 |
| 2.659647000055759 | 1 |
| 2.680082000359892 | 1 |
| 2.700515999957918 | 1 |
| 2.720951000262051 | 1 |
| 2.741385000325739 | 1 |
| 2.76182000016421 | 1 |
| 2.782254000227898 | 1 |
| 2.802688000291585 | 1 |
| 2.823123000130056 | 1 |
| 2.843557000193744 | 1 |
| 2.863992000032216 | 1 |
| 2.884426000095903 | 1 |
| 2.904861000400036 | 1 |
| 2.925294999998062 | 1 |
| 2.945730000302195 | 1 |
| 2.966164000365882 | 1 |
| 2.986597999963909 | 1 |
| 3.007033000268041 | 1 |
| 3.027467000331729 | 1 |
| 3.0479020001702 | 1 |
| 3.068336000233888 | 1 |
| 3.08877100007236 | 1 |
| 3.109205000136047 | 1 |
| 3.129639000199734 | 1 |
| 3.150074000038206 | 1 |
| 3.170508000101893 | 1 |
| 3.190943000406026 | 1 |
| 3.211377000004052 | 1 |
| 3.231812000308185 | 1 |
| 0.0175460003718726 | 1 |
| 0.037981000210344 | 1 |
| 0.0584150002740316 | 1 |
| 0.0788490003377191 | 1 |
| 0.0992840001761905 | 0.992 |
| 0.119718000239878 | 0.99 |
| 0.14015300007835 | 0.99 |
| 0.160587000142037 | 0.989 |
| 0.181021999980508 | 0.99 |
| 0.201456000044196 | 0.991 |
| 0.221890000107884 | 0.996 |
| 0.242325000412016 | 1 |
| 0.262759000010043 | 1 |
| 0.283194000314175 | 1 |
| 0.303628000377863 | 1 |
| 0.324063000216334 | 1 |
| 0.344497000280022 | 1 |
| 0.364931000343709 | 1 |
| 0.385366000182181 | 1 |
| 0.405800000245868 | 1 |
| 0.42623500008434 | 1 |
| 0.446669000148027 | 1 |
| 0.467103999986499 | 1 |
| 0.487538000050186 | 1 |
| 0.507972000113874 | 1 |
| 0.528407000418007 | 1 |
| 0.548841000016033 | 1 |
| 0.569276000320166 | 1 |
| 0.589710000383853 | 1 |
| 0.610145000222324 | 1 |
| 0.630579000286012 | 1 |
| 0.6510130003497 | 1 |
| 0.671448000188171 | 1 |
| 0.691882000251859 | 1 |
| 0.71231700009033 | 1 |
| 0.732751000154018 | 1 |
| 0.753185999992489 | 1 |
| 0.773620000056177 | 1 |
| 0.794055000360309 | 1 |
| 0.814488999958336 | 1 |
| 0.834924000262468 | 1 |
| 0.855358000326156 | 1 |
| 0.875792000389843 | 1 |
| 0.896227000228315 | 1 |
| 0.916661000292002 | 1 |
| 0.937096000130474 | 1 |
| 0.957530000194161 | 1 |
| 0.977964000257849 | 1 |
| 0.99839900009632 | 1 |
| 1.018833000160008 | 1 |
| 1.039267999998479 | 1 |
| 1.059702000062167 | 1 |
| 1.0801370003663 | 1 |
| 1.100570999964326 | 1 |
| 1.121006000268459 | 1 |
| 1.141440000332146 | 1 |
| 1.161874000395834 | 1 |
| 1.182309000234305 | 1 |
| 1.202743000297993 | 1 |
| 1.223178000136464 | 1 |
| 1.243612000200152 | 1 |
| 1.264047000038623 | 1 |
| 1.284481000102311 | 1 |
| 1.304915000165998 | 1 |
| 1.32535000000447 | 1 |
| 1.345784000068157 | 1 |
| 1.36621900037229 | 1 |
| 1.386652999970316 | 1 |
| 1.407088000274449 | 1 |
| 1.427522000338136 | 1 |
| 1.447956000401824 | 1 |
| 1.468391000240295 | 1 |
| 1.488825000303983 | 1 |
| 1.509260000142454 | 1 |
| 1.529694000206142 | 1 |
| 1.550129000044613 | 1 |
| 1.570563000108301 | 1 |
| 1.590998000412434 | 1 |
| 1.61143200001046 | 1 |
| 1.631866000074147 | 1 |
| 1.65230100037828 | 1 |
| 1.672734999976306 | 1 |
| 1.693170000280439 | 1 |
| 1.713604000344127 | 1 |
| 1.734039000182598 | 1 |
| 1.754473000246286 | 1 |
| 1.774907000309973 | 1 |
| 1.795342000148444 | 1 |
| 1.815776000212132 | 1 |
| 1.836211000050604 | 1 |
| 1.856645000114291 | 1 |
| 1.877080000418424 | 1 |
| 1.89751400001645 | 1 |
| 1.917949000320583 | 1 |
| 1.93838300038427 | 1 |
| 1.958816999982297 | 1 |
| 1.979252000286429 | 1 |
| 1.999686000350117 | 1 |
| 2.020121000188588 | 1 |
| 2.040555000252276 | 1 |
| 2.060990000090747 | 1 |
| 2.081424000154435 | 1 |
| 2.122293000056594 | 1 |
| 2.142727000120281 | 1 |
| 2.163161999958753 | 1 |
| 2.18359600002244 | 1 |
| 2.204031000326573 | 1 |
| 2.224465000390261 | 1 |
| 2.244898999988287 | 1 |
| 2.26533400029242 | 1 |
| 2.285768000356107 | 1 |
| 2.306203000194579 | 1 |
| 2.326637000258266 | 1 |
| 2.347072000096737 | 1 |
| 2.367506000160425 | 1 |
| 2.387940000224113 | 1 |
| 2.408375000062584 | 1 |
| 2.428809000126272 | 1 |
| 2.449243999964743 | 1 |
| 2.469678000028431 | 1 |
| 2.490113000332563 | 1 |
| 2.510547000396251 | 1 |
| 2.530982000234722 | 1 |
| 2.55141600029841 | 1 |
| 2.571850000362097 | 1 |
| 2.592285000200569 | 1 |
| 2.612719000264256 | 1 |
| 2.633154000102728 | 1 |
| 2.653588000166415 | 1 |
| 2.674023000004887 | 1 |
| 2.694457000068574 | 1 |
| 2.714891000132262 | 1 |
| 2.735325999970733 | 1 |
| 2.755760000034421 | 1 |
| 2.776195000338554 | 1 |
| 2.796629000402241 | 1 |
| 2.817064000240713 | 1 |
| 2.8374980003044 | 1 |
| 2.857933000142871 | 1 |
| 2.87836700020656 | 1 |
| 2.898801000270247 | 1 |
| 2.919236000108718 | 1 |
| 2.939670000172406 | 1 |
| 2.960105000010877 | 1 |
| 2.980539000074565 | 1 |
| 3.000974000378697 | 1 |
| 3.021407999976724 | 1 |
| 3.041842000040411 | 1 |
| 3.062277000344544 | 1 |
| 3.082711000408231 | 1 |
| 3.103146000246703 | 1 |
| 3.12358000031039 | 1 |
| 3.144014000374078 | 1 |
| 3.164449000212549 | 1 |
| 3.184883000276237 | 1 |
| 3.205318000114708 | 1 |
| 3.225752000178396 | 1 |
| 0.0114870000168672 | 1 |
| 0.0319210000805548 | 1 |
| 0.0523560003846875 | 1 |
| 0.0727899999827137 | 1 |
| 0.0932250002868464 | 0.994 |
| 0.113659000350534 | 0.991 |
| 0.134093000414222 | 0.99 |
| 0.154528000252693 | 0.99 |
| 0.174962000316381 | 0.99 |
| 0.195397000154852 | 0.991 |
| 0.21583100021854 | 0.993 |
| 0.236265000282227 | 1 |
| 0.256700000120698 | 1 |
| 0.277134000184386 | 1 |
| 0.297569000022857 | 1 |
| 0.318003000086545 | 1 |
| 0.338438000390678 | 1 |
| 0.358871999988704 | 1 |
| 0.379307000292837 | 1 |
| 0.399741000356524 | 1 |
| 0.420176000194996 | 1 |
| 0.440610000258683 | 1 |
| 0.461044000322371 | 1 |
| 0.481479000160842 | 1 |
| 0.50191300022453 | 1 |
| 0.522348000063001 | 1 |
| 0.542782000126689 | 1 |
| 0.563216000190376 | 1 |
| 0.583651000028848 | 1 |
| 0.604085000092535 | 1 |
| 0.624520000396668 | 1 |
| 0.644953999994694 | 1 |
| 0.665389000298827 | 1 |
| 0.685823000362514 | 1 |
| 0.706256999960541 | 1 |
| 0.726692000264673 | 1 |
| 0.747126000328361 | 1 |
| 0.767561000166832 | 1 |
| 0.78799500023052 | 1 |
| 0.808430000068991 | 1 |
| 0.828864000132679 | 1 |
| 0.84929899997115 | 1 |
| 0.869733000034838 | 1 |
| 0.890167000098525 | 1 |
| 0.910602000402658 | 1 |
| 0.931036000000685 | 1 |
| 0.951471000304817 | 1 |
| 0.971905000368505 | 1 |
| 0.992340000206976 | 1 |
| 1.012774000270664 | 1 |
| 1.033208000334351 | 1 |
| 1.053643000172823 | 1 |
| 1.07407700023651 | 1 |
| 1.094512000074982 | 1 |
| 1.114946000138669 | 1 |
| 1.135380999977141 | 1 |
| 1.155815000040828 | 1 |
| 1.176250000344961 | 1 |
| 1.196684000408648 | 1 |
| 1.217118000006675 | 1 |
| 1.237553000310807 | 1 |
| 1.257987000374495 | 1 |
| 1.278422000212966 | 1 |
| 1.298856000276654 | 1 |
| 1.319291000115125 | 1 |
| 1.339725000178813 | 1 |
| 1.360159000242501 | 1 |
| 1.380594000080972 | 1 |
| 1.40102800014466 | 1 |
| 1.421462999983131 | 1 |
| 1.441897000046819 | 1 |
| 1.462332000350951 | 1 |
| 1.482766000414639 | 1 |
| 1.503200000012665 | 1 |
| 1.523635000316798 | 1 |
| 1.544069000380485 | 1 |
| 1.564504000218957 | 1 |
| 1.584938000282644 | 1 |
| 1.605373000121116 | 1 |
| 1.625807000184803 | 1 |
| 1.646241000248491 | 1 |
| 1.666676000086962 | 1 |
| 1.68711000015065 | 1 |
| 1.707544999989121 | 1 |
| 1.727979000052809 | 1 |
| 1.748414000356941 | 1 |
| 1.768847999954968 | 1 |
| 1.7892830002591 | 1 |
| 1.809717000322788 | 1 |
| 1.830151000386476 | 1 |
| 1.871020000288635 | 1 |
| 1.891455000127106 | 1 |
| 1.911889000190794 | 1 |
| 1.932324000029265 | 1 |
| 1.952758000092952 | 1 |
| 1.97319200015664 | 1 |
| 1.993626999995111 | 1 |
| 2.014061000058799 | 1 |
| 2.034496000362932 | 1 |
| 2.054929999960958 | 1 |
| 2.075365000265091 | 1 |
| 2.095799000328778 | 1 |
| 2.11623400016725 | 1 |
| 2.136668000230937 | 1 |
| 2.157102000294625 | 1 |
| 2.177537000133096 | 1 |
| 2.197971000196784 | 1 |
| 2.218406000035255 | 1 |
| 2.238840000098943 | 1 |
| 2.259275000403075 | 1 |
| 2.279709000001102 | 1 |
| 2.300143000064789 | 1 |
| 2.320578000368922 | 1 |
| 2.341011999966948 | 1 |
| 2.361447000271081 | 1 |
| 2.381881000334769 | 1 |
| 2.40231600017324 | 1 |
| 2.422750000236928 | 1 |
| 2.443184000300615 | 1 |
| 2.463619000139086 | 1 |
| 2.484053000202774 | 1 |
| 2.504488000041245 | 1 |
| 2.524922000104933 | 1 |
| 2.545357000409066 | 1 |
| 2.565791000007092 | 1 |
| 2.58622500007078 | 1 |
| 2.606660000374912 | 1 |
| 2.627093999972938 | 1 |
| 2.647529000277071 | 1 |
| 2.667963000340759 | 1 |
| 2.68839800017923 | 1 |
| 2.708832000242917 | 1 |
| 2.729266000306605 | 1 |
| 2.749701000145076 | 1 |
| 2.770135000208764 | 1 |
| 2.790570000047236 | 1 |
| 2.811004000110923 | 1 |
| 2.831439000415056 | 1 |
| 2.851873000013082 | 1 |
| 2.872308000317215 | 1 |
| 2.892742000380902 | 1 |
| 2.913175999978929 | 1 |
| 2.933611000283062 | 1 |
| 2.954045000346749 | 1 |
| 2.97448000018522 | 1 |
| 2.994914000248908 | 1 |
| 3.015349000087379 | 1 |
| 3.035783000151067 | 1 |
| 3.056217999989538 | 1 |
| 3.076652000053226 | 1 |
| 3.097086000116913 | 1 |
| 3.117520999955385 | 1 |
| 3.137955000019073 | 1 |
| 3.158390000323205 | 1 |
| 3.178824000386893 | 1 |
| 3.199259000225364 | 1 |
| 3.219693000289052 | 1 |
| 0.00542700035273924 | 1 |
| 0.0258620001912106 | 1 |
| 0.0462960002548982 | 1 |
| 0.0667310000933696 | 1 |
| 0.0871650001570572 | 0.997 |
| 0.107599999995529 | 0.991 |
| 0.128034000059216 | 0.99 |
| 0.148468000122904 | 0.989 |
| 0.168902999961375 | 0.99 |
| 0.189337000025063 | 0.99 |
| 0.209772000329195 | 0.992 |
| 0.230206000392883 | 0.999 |
| 0.250641000231354 | 1 |
| 0.271075000295042 | 1 |
| 0.291509000358729 | 1 |
| 0.311944000197201 | 1 |
| 0.332378000260888 | 1 |
| 0.35281300009936 | 1 |
| 0.373247000163047 | 1 |
| 0.393682000001519 | 1 |
| 0.414116000065206 | 1 |
| 0.434551000369339 | 1 |
| 0.454984999967365 | 1 |
| 0.475419000031053 | 1 |
| 0.495854000335186 | 1 |
| 0.516288000398873 | 1 |
| 0.536723000237345 | 1 |
| 0.557157000301032 | 1 |
| 0.577592000139504 | 1 |
| 0.598026000203191 | 1 |
| 0.618460000266879 | 1 |
| 0.63889500010535 | 1 |
| 0.659329000169038 | 1 |
| 0.679764000007509 | 1 |
| 0.700198000071197 | 1 |
| 0.720633000375329 | 1 |
| 0.741066999973356 | 1 |
| 0.761502000277488 | 1 |
| 0.781936000341176 | 1 |
| 0.802370000404863 | 1 |
| 0.822805000243335 | 1 |
| 0.843239000307022 | 1 |
| 0.863674000145494 | 1 |
| 0.884108000209181 | 1 |
| 0.904543000047653 | 1 |
| 0.92497700011134 | 1 |
| 0.945411000175028 | 1 |
| 0.965846000013499 | 1 |
| 0.986280000077187 | 1 |
| 1.00671500038132 | 1 |
| 1.027148999979346 | 1 |
| 1.047584000283479 | 1 |
| 1.068018000347166 | 1 |
| 1.088452000410854 | 1 |
| 1.108887000249325 | 1 |
| 1.129321000313013 | 1 |
| 1.149756000151484 | 1 |
| 1.170190000215172 | 1 |
| 1.190625000053643 | 1 |
| 1.211059000117331 | 1 |
| 1.231493999955802 | 1 |
| 1.25192800001949 | 1 |
| 1.272362000083177 | 1 |
| 1.29279700038731 | 1 |
| 1.313230999985336 | 1 |
| 1.333666000289469 | 1 |
| 1.354100000353156 | 1 |
| 1.374535000191628 | 1 |
| 1.394969000255315 | 1 |
| 1.415403000319003 | 1 |
| 1.435838000157474 | 1 |
| 1.456272000221162 | 1 |
| 1.476707000059633 | 1 |
| 1.497141000123321 | 1 |
| 1.517575999961792 | 1 |
| 1.53801000002548 | 1 |
| 1.558444000089167 | 1 |
| 1.5788790003933 | 1 |
| 1.619748000295459 | 1 |
| 1.640182000359147 | 1 |
| 1.660617000197618 | 1 |
| 1.681051000261306 | 1 |
| 1.701485000324993 | 1 |
| 1.721920000163465 | 1 |
| 1.742354000227152 | 1 |
| 1.762789000065624 | 1 |
| 1.783223000129311 | 1 |
| 1.803657999967783 | 1 |
| 1.82409200003147 | 1 |
| 1.844526000095158 | 1 |
| 1.86496100039929 | 1 |
| 1.905830000301449 | 1 |
| 1.926264000365137 | 1 |
| 1.946699000203608 | 1 |
| 1.967133000267296 | 1 |
| 1.987568000105767 | 1 |
| 2.008002000169455 | 1 |
| 2.028436000233143 | 1 |
| 2.048871000071614 | 1 |
| 2.069305000135301 | 1 |
| 2.089739999973773 | 1 |
| 2.11017400003746 | 1 |
| 2.130609000341593 | 1 |
| 2.151043000405281 | 1 |
| 2.171477000003307 | 1 |
| 2.19191200030744 | 1 |
| 2.212346000371127 | 1 |
| 2.232781000209599 | 1 |
| 2.253215000273286 | 1 |
| 2.273650000111758 | 1 |
| 2.294084000175445 | 1 |
| 2.314519000013917 | 1 |
| 2.334953000077604 | 1 |
| 2.355387000141292 | 1 |
| 2.375821999979763 | 1 |
| 2.396256000043451 | 1 |
| 2.416691000347583 | 1 |
| 2.437125000411271 | 1 |
| 2.457560000249742 | 1 |
| 2.47799400031343 | 1 |
| 2.498428000377117 | 1 |
| 2.518863000215589 | 1 |
| 2.539297000279277 | 1 |
| 2.559732000117748 | 1 |
| 2.580166000181435 | 1 |
| 2.600601000019907 | 1 |
| 2.621035000083594 | 1 |
| 2.641469000147282 | 1 |
| 2.661903999985753 | 1 |
| 2.682338000049441 | 1 |
| 2.702773000353574 | 1 |
| 2.723207000417261 | 1 |
| 2.743642000255733 | 1 |
| 2.76407600031942 | 1 |
| 2.784510000383108 | 1 |
| 2.804945000221579 | 1 |
| 2.825379000285267 | 1 |
| 2.845814000123738 | 1 |
| 2.866248000187426 | 1 |
| 2.886683000025897 | 1 |
| 2.907117000089585 | 1 |
| 2.927552000393717 | 1 |
| 2.947985999991744 | 1 |
| 2.968420000055431 | 1 |
| 2.988855000359564 | 1 |
| 3.00928899995759 | 1 |
| 3.029724000261723 | 1 |
| 3.050158000325411 | 1 |
| 3.070593000163882 | 1 |
| 3.091027000227569 | 1 |
| 3.111461000291257 | 1 |
| 3.131896000129728 | 1 |
| 3.152330000193416 | 1 |
| 3.172765000031887 | 1 |
| 3.193199000095575 | 1 |
| 3.213634000399708 | 1 |
| 3.234067999997734 | 1 |
| 0.0198030003018665 | 1 |
| 0.0402370003655541 | 1 |
| 0.0606709999635804 | 1 |
| 0.0811060002677131 | 0.999 |
| 0.101540000331401 | 0.992 |
| 0.121975000169872 | 0.99 |
| 0.14240900023356 | 0.99 |
| 0.162844000072031 | 0.989 |
| 0.183278000135719 | 0.99 |
| 0.203712000199406 | 0.991 |
| 0.224147000037878 | 0.997 |
| 0.244581000101565 | 1 |
| 0.265016000405698 | 1 |
| 0.285450000003724 | 1 |
| 0.305885000307857 | 1 |
| 0.326319000371544 | 1 |
| 0.346752999969571 | 1 |
| 0.367188000273703 | 1 |
| 0.387622000337391 | 1 |
| 0.408057000175862 | 1 |
| 0.42849100023955 | 1 |
| 0.448926000078021 | 1 |
| 0.469360000141709 | 1 |
| 0.48979499998018 | 1 |
| 0.510229000043868 | 1 |
| 0.530663000107555 | 1 |
| 0.551098000411688 | 1 |
| 0.571532000009714 | 1 |
| 0.591967000313847 | 1 |
| 0.612401000377535 | 1 |
| 0.632834999975561 | 1 |
| 0.653270000279694 | 1 |
| 0.673704000343381 | 1 |
| 0.694139000181852 | 1 |
| 0.71457300024554 | 1 |
| 0.735008000084011 | 1 |
| 0.755442000147699 | 1 |
| 0.77587699998617 | 1 |
| 0.796311000049858 | 1 |
| 0.816746000353991 | 1 |
| 0.837180000417678 | 1 |
| 0.857614000015705 | 1 |
| 0.878049000319837 | 1 |
| 0.898483000383525 | 1 |
| 0.918918000221996 | 1 |
| 0.939352000285684 | 1 |
| 0.959786000349371 | 1 |
| 0.980221000187843 | 1 |
| 1.00065500025153 | 1 |
| 1.021090000090002 | 1 |
| 1.041524000153689 | 1 |
| 1.061958999992161 | 1 |
| 1.082393000055848 | 1 |
| 1.102828000359981 | 1 |
| 1.123261999958007 | 1 |
| 1.143696000021695 | 1 |
| 1.164131000325828 | 1 |
| 1.184565000389515 | 1 |
| 1.205000000227987 | 1 |
| 1.225434000291674 | 1 |
| 1.245869000130146 | 1 |
| 1.266303000193833 | 1 |
| 1.286737000257521 | 1 |
| 1.307172000095992 | 1 |
| 1.32760600015968 | 1 |
| 1.368475000061839 | 1 |
| 1.388910000365971 | 1 |
| 1.409343999963998 | 1 |
| 1.429778000027685 | 1 |
| 1.450213000331818 | 1 |
| 1.470647000395505 | 1 |
| 1.491082000233977 | 1 |
| 1.511516000297664 | 1 |
| 1.531951000136136 | 1 |
| 1.552385000199823 | 1 |
| 1.572820000038295 | 1 |
| 1.593254000101982 | 1 |
| 1.61368800016567 | 1 |
| 1.634123000004141 | 1 |
| 1.654557000067829 | 1 |
| 1.674992000371962 | 1 |
| 1.695425999969988 | 1 |
| 1.715861000274121 | 1 |
| 1.736295000337808 | 1 |
| 1.756730000176279 | 1 |
| 1.777164000239967 | 1 |
| 1.797598000303655 | 1 |
| 1.818033000142126 | 1 |
| 1.838467000205814 | 1 |
| 1.858902000044285 | 1 |
| 1.879336000107973 | 1 |
| 1.899771000412105 | 1 |
| 1.920205000010132 | 1 |
| 1.940639000073819 | 1 |
| 1.961074000377952 | 1 |
| 1.981507999975978 | 1 |
| 2.001943000280111 | 1 |
| 2.022377000343798 | 1 |
| 2.04281200018227 | 1 |
| 2.063246000245957 | 1 |
| 2.083680000309645 | 1 |
| 2.104115000148116 | 1 |
| 2.124549000211804 | 1 |
| 2.144984000050275 | 1 |
| 2.165418000113963 | 1 |
| 2.185853000418096 | 1 |
| 2.206287000016122 | 1 |
| 2.226721000079809 | 1 |
| 2.247156000383942 | 1 |
| 2.267589999981968 | 1 |
| 2.288025000286101 | 1 |
| 2.308459000349789 | 1 |
| 2.32889400018826 | 1 |
| 2.349328000251948 | 1 |
| 2.369762000315635 | 1 |
| 2.390197000154107 | 1 |
| 2.410631000217794 | 1 |
| 2.431066000056266 | 1 |
| 2.451500000119953 | 1 |
| 2.471934999958425 | 1 |
| 2.492369000022112 | 1 |
| 2.512804000326245 | 1 |
| 2.533238000389932 | 1 |
| 2.553671999987959 | 1 |
| 2.574107000292091 | 1 |
| 2.594541000355779 | 1 |
| 2.61497600019425 | 1 |
| 2.635410000257938 | 1 |
| 2.655845000096409 | 1 |
| 2.676279000160097 | 1 |
| 2.696713000223784 | 1 |
| 2.717148000062256 | 1 |
| 2.737582000125943 | 1 |
| 2.758016999964415 | 1 |
| 2.778451000028102 | 1 |
| 2.798886000332235 | 1 |
| 2.819320000395923 | 1 |
| 2.839753999993949 | 1 |
| 2.860189000298082 | 1 |
| 2.880623000361769 | 1 |
| 2.901058000200241 | 1 |
| 2.921492000263928 | 1 |
| 2.9419270001024 | 1 |
| 2.962361000166087 | 1 |
| 2.982795000229775 | 1 |
| 3.003230000068246 | 1 |
| 3.023664000131933 | 1 |
| 3.044098999970405 | 1 |
| 3.064533000034092 | 1 |
| 3.084968000338225 | 1 |
| 3.105402000401913 | 1 |
| 3.125837000240384 | 1 |
| 3.146271000304072 | 1 |
| 3.166705000367759 | 1 |
| 3.187140000206231 | 1 |
| 3.207574000269918 | 1 |
| 3.22800900010839 | 1 |
| 0.0137430001720773 | 1 |
| 0.0341780000105487 | 1 |
| 0.0546120000742363 | 1 |
| 0.075047000378369 | 1 |
| 0.0954809999763952 | 0.994 |
| 0.115915000040083 | 0.991 |
| 0.136350000344216 | 0.99 |
| 0.156784000407903 | 0.989 |
| 0.177219000246374 | 0.99 |
| 0.197653000310062 | 0.991 |
| 0.218088000148533 | 0.994 |
| 0.238522000212221 | 1 |
| 0.258956000275909 | 1 |
| 0.27939100011438 | 1 |
| 0.299825000178068 | 1 |
| 0.320260000016539 | 1 |
| 0.340694000080226 | 1 |
| 0.361129000384359 | 1 |
| 0.381562999982385 | 1 |
| 0.401997000046073 | 1 |
| 0.422432000350206 | 1 |
| 0.442866000413893 | 1 |
| 0.463301000252365 | 1 |
| 0.483735000316052 | 1 |
| 0.504170000154524 | 1 |
| 0.524604000218211 | 1 |
| 0.545038000281899 | 1 |
| 0.56547300012037 | 1 |
| 0.585907000184058 | 1 |
| 0.606342000022529 | 1 |
| 0.626776000086217 | 1 |
| 0.647211000390349 | 1 |
| 0.667644999988376 | 1 |
| 0.688079000052063 | 1 |
| 0.708514000356196 | 1 |
| 0.728947999954222 | 1 |
| 0.749383000258355 | 1 |
| 0.769817000322043 | 1 |
| 0.790252000160514 | 1 |
| 0.810686000224202 | 1 |
| 0.831121000062673 | 1 |
| 0.85155500012636 | 1 |
| 0.871989000190048 | 1 |
| 0.892424000028519 | 1 |
| 0.912858000092207 | 1 |
| 0.93329300039634 | 1 |
| 0.953726999994366 | 1 |
| 0.974162000298499 | 1 |
| 0.994596000362186 | 1 |
| 1.015029999960213 | 1 |
| 1.035465000264345 | 1 |
| 1.055899000328033 | 1 |
| 1.076334000166504 | 1 |
| 1.117203000068663 | 1 |
| 1.137637000132351 | 1 |
| 1.158071999970822 | 1 |
| 1.17850600003451 | 1 |
| 1.198940000098197 | 1 |
| 1.21937500040233 | 1 |
| 1.239809000000356 | 1 |
| 1.260244000304489 | 1 |
| 1.280678000368177 | 1 |
| 1.301113000206648 | 1 |
| 1.321547000270336 | 1 |
| 1.341981000334023 | 1 |
| 1.362416000172494 | 1 |
| 1.382850000236182 | 1 |
| 1.403285000074653 | 1 |
| 1.423719000138341 | 1 |
| 1.444153999976812 | 1 |
| 1.4645880000405 | 1 |
| 1.485022000104188 | 1 |
| 1.50545700040832 | 1 |
| 1.525891000006347 | 1 |
| 1.546326000310479 | 1 |
| 1.566760000374167 | 1 |
| 1.587195000212638 | 1 |
| 1.607629000276326 | 1 |
| 1.628064000114797 | 1 |
| 1.648498000178485 | 1 |
| 1.668932000242172 | 1 |
| 1.689367000080644 | 1 |
| 1.709801000144331 | 1 |
| 1.730235999982803 | 1 |
| 1.75067000004649 | 1 |
| 1.771105000350623 | 1 |
| 1.79153900041431 | 1 |
| 1.811973000012337 | 1 |
| 1.83240800031647 | 1 |
| 1.852842000380157 | 1 |
| 1.873277000218628 | 1 |
| 1.893711000282316 | 1 |
| 1.914146000120787 | 1 |
| 1.934580000184475 | 1 |
| 1.955015000022946 | 1 |
| 1.975449000086634 | 1 |
| 1.995883000150322 | 1 |
| 2.016317999988793 | 1 |
| 2.036752000052481 | 1 |
| 2.057187000356613 | 1 |
| 2.07762099995464 | 1 |
| 2.098056000258772 | 1 |
| 2.11849000032246 | 1 |
| 2.138924000386147 | 1 |
| 2.159359000224619 | 1 |
| 2.179793000288306 | 1 |
| 2.200228000126778 | 1 |
| 2.220662000190465 | 1 |
| 2.241097000028936 | 1 |
| 2.261531000092624 | 1 |
| 2.281965000156312 | 1 |
| 2.302399999994783 | 1 |
| 2.322834000058471 | 1 |
| 2.343269000362603 | 1 |
| 2.36370299996063 | 1 |
| 2.384137000024317 | 1 |
| 2.404571000088005 | 1 |
| 2.425006000392138 | 1 |
| 2.445439999990164 | 1 |
| 2.465875000294297 | 1 |
| 2.486309000357984 | 1 |
| 2.506744000196456 | 1 |
| 2.527178000260143 | 1 |
| 2.547613000098615 | 1 |
| 2.568047000162302 | 1 |
| 2.58848100022599 | 1 |
| 2.608916000064461 | 1 |
| 2.629350000128149 | 1 |
| 2.64978499996662 | 1 |
| 2.670219000030308 | 1 |
| 2.69065400033444 | 1 |
| 2.711088000398128 | 1 |
| 2.731521999996154 | 1 |
| 2.751957000300287 | 1 |
| 2.772391000363974 | 1 |
| 2.792826000202446 | 1 |
| 2.813260000266133 | 1 |
| 2.833695000104605 | 1 |
| 2.854129000168292 | 1 |
| 2.87456300023198 | 1 |
| 2.894998000070451 | 1 |
| 2.915432000134139 | 1 |
| 2.93586699997261 | 1 |
| 2.956301000036298 | 1 |
| 2.976736000340431 | 1 |
| 2.997170000404118 | 1 |
| 3.017604000002144 | 1 |
| 3.038039000306277 | 1 |
| 3.058473000369965 | 1 |
| 3.078908000208436 | 1 |
| 3.099342000272124 | 1 |
| 3.119777000110595 | 1 |
| 3.140211000174283 | 1 |
| 3.160646000012754 | 1 |
| 3.181080000076442 | 1 |
| 3.20151400014013 | 1 |
| 3.221948999978601 | 1 |
| 0.00768300004228806 | 1 |
| 0.0281180003464208 | 1 |
| 0.0485520004101083 | 1 |
| 0.0689860000081346 | 1 |
| 0.0894210003122673 | 0.996 |
| 0.109855000375955 | 0.991 |
| 0.130290000214426 | 0.99 |
| 0.150724000278114 | 0.989 |
| 0.171159000116585 | 0.99 |
| 0.191593000180273 | 0.99 |
| 0.212028000018744 | 0.992 |
| 0.232462000082432 | 0.999 |
| 0.252897000386564 | 1 |
| 0.273330999984591 | 1 |
| 0.293765000048278 | 1 |
| 0.314200000352411 | 1 |
| 0.334634000416099 | 1 |
| 0.35506900025457 | 1 |
| 0.375503000318258 | 1 |
| 0.395938000156729 | 1 |
| 0.416372000220417 | 1 |
| 0.436806000284104 | 1 |
| 0.457241000122575 | 1 |
| 0.477675000186263 | 1 |
| 0.498110000024734 | 1 |
| 0.518544000088422 | 1 |
| 0.538979000392555 | 1 |
| 0.559412999990581 | 1 |
| 0.579847000054269 | 1 |
| 0.600282000358401 | 1 |
| 0.620715999956427 | 1 |
| 0.64115100026056 | 1 |
| 0.661585000324248 | 1 |
| 0.682020000162719 | 1 |
| 0.702454000226407 | 1 |
| 0.722889000064878 | 1 |
| 0.743323000128566 | 1 |
| 0.763757000192253 | 1 |
| 0.784192000030725 | 1 |
| 0.804626000094412 | 1 |
| 0.825061000398545 | 1 |
| 0.865929000060259 | 1 |
| 0.886364000364391 | 1 |
| 0.906797999962418 | 1 |
| 0.927233000266551 | 1 |
| 0.947667000330238 | 1 |
| 0.968102000168709 | 1 |
| 0.988536000232397 | 1 |
| 1.008971000070868 | 1 |
| 1.029405000134556 | 1 |
| 1.049839000198244 | 1 |
| 1.070274000036715 | 1 |
| 1.090708000100403 | 1 |
| 1.111143000404535 | 1 |
| 1.131577000002562 | 1 |
| 1.152012000306694 | 1 |
| 1.172446000370382 | 1 |
| 1.192879999968408 | 1 |
| 1.213315000272541 | 1 |
| 1.233749000336228 | 1 |
| 1.2541840001747 | 1 |
| 1.274618000238387 | 1 |
| 1.295053000076859 | 1 |
| 1.315487000140546 | 1 |
| 1.335921999979018 | 1 |
| 1.356356000042705 | 1 |
| 1.376790000106393 | 1 |
| 1.397225000410525 | 1 |
| 1.417659000008552 | 1 |
| 1.438094000312684 | 1 |
| 1.458528000376372 | 1 |
| 1.478963000214843 | 1 |
| 1.499397000278531 | 1 |
| 1.519831000342219 | 1 |
| 1.54026600018069 | 1 |
| 1.560700000244378 | 1 |
| 1.58113500008285 | 1 |
| 1.601569000146536 | 1 |